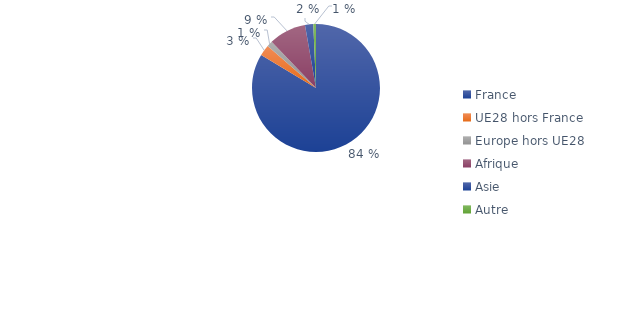
| Category | Series 0 |
|---|---|
| France | 0.836 |
| UE28 hors France | 0.028 |
| Europe hors UE28 | 0.014 |
| Afrique | 0.094 |
| Asie | 0.021 |
| Autre | 0.007 |